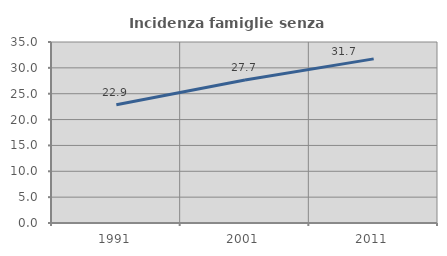
| Category | Incidenza famiglie senza nuclei |
|---|---|
| 1991.0 | 22.857 |
| 2001.0 | 27.656 |
| 2011.0 | 31.737 |